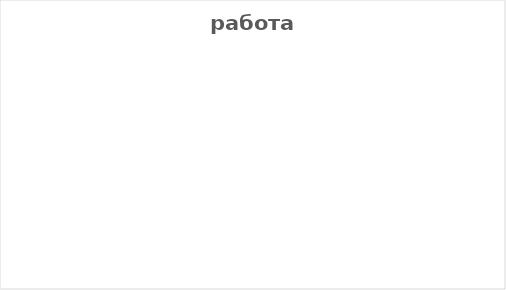
| Category | Series 0 |
|---|---|
| Монолог | 0 |
| Неравн. диалог | 0 |
| Диалог | 0 |
| Сумбур | 0 |